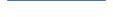
| Category | Series 0 |
|---|---|
| 0 | 2 |
| 1 | 2 |
| 2 | 1 |
| 3 | 2 |
| 4 | 1 |
| 5 | 1 |
| 6 | 0 |
| 7 | 4 |
| 8 | 1 |